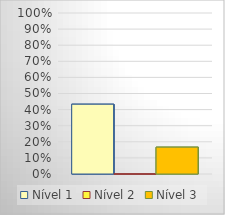
| Category | Nível 1 | Nível 2 | Nível 3 |
|---|---|---|---|
| 0 | 0.433 | 0 | 0.167 |